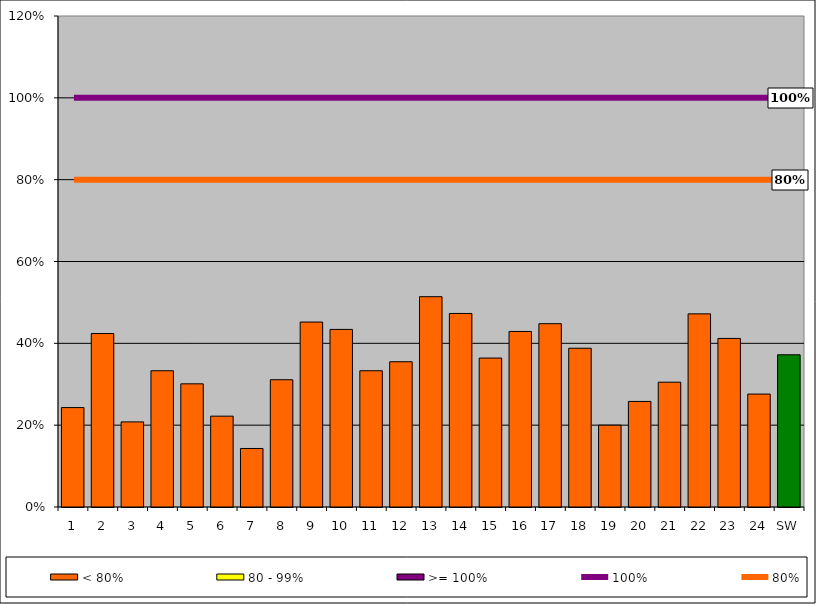
| Category | < 80% | 80 - 99% | >= 100% |
|---|---|---|---|
| 1 | 0.243 | 0 | 0 |
| 2 | 0.424 | 0 | 0 |
| 3 | 0.208 | 0 | 0 |
| 4 | 0.333 | 0 | 0 |
| 5 | 0.301 | 0 | 0 |
| 6 | 0.222 | 0 | 0 |
| 7 | 0.143 | 0 | 0 |
| 8 | 0.311 | 0 | 0 |
| 9 | 0.452 | 0 | 0 |
| 10 | 0.434 | 0 | 0 |
| 11 | 0.333 | 0 | 0 |
| 12 | 0.355 | 0 | 0 |
| 13 | 0.514 | 0 | 0 |
| 14 | 0.473 | 0 | 0 |
| 15 | 0.364 | 0 | 0 |
| 16 | 0.429 | 0 | 0 |
| 17 | 0.448 | 0 | 0 |
| 18 | 0.388 | 0 | 0 |
| 19 | 0.2 | 0 | 0 |
| 20 | 0.258 | 0 | 0 |
| 21 | 0.305 | 0 | 0 |
| 22 | 0.472 | 0 | 0 |
| 23 | 0.412 | 0 | 0 |
| 24 | 0.276 | 0 | 0 |
| SW | 0.372 | 0 | 0 |